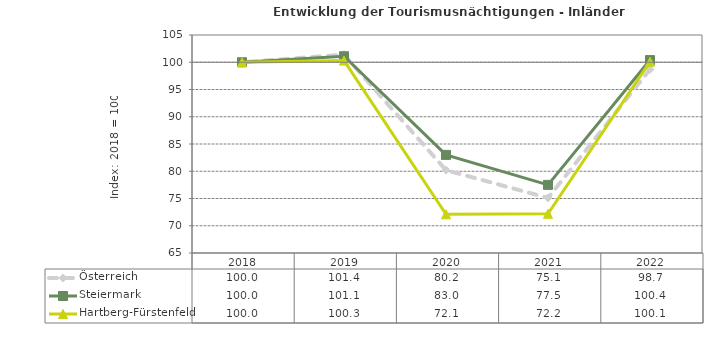
| Category | Österreich | Steiermark | Hartberg-Fürstenfeld |
|---|---|---|---|
| 2022.0 | 98.7 | 100.4 | 100.1 |
| 2021.0 | 75.1 | 77.5 | 72.2 |
| 2020.0 | 80.2 | 83 | 72.1 |
| 2019.0 | 101.4 | 101.1 | 100.3 |
| 2018.0 | 100 | 100 | 100 |